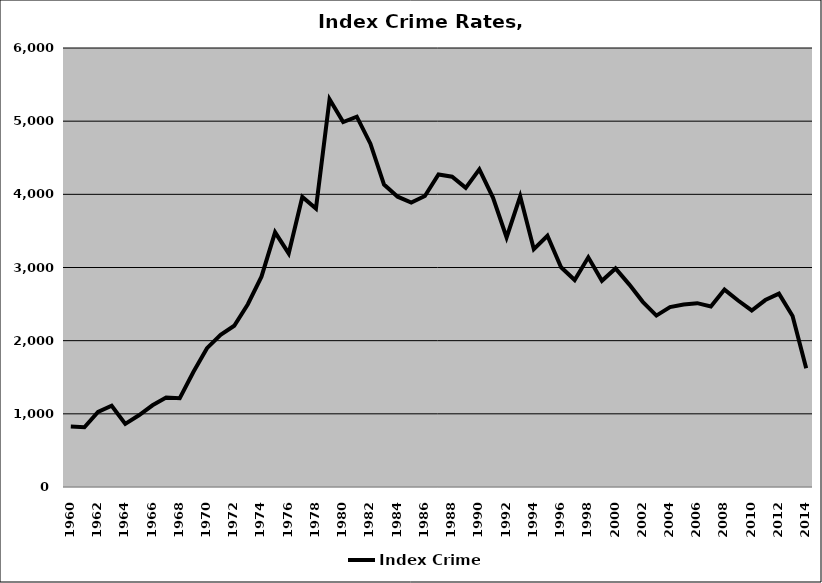
| Category | Index Crime |
|---|---|
| 1960.0 | 825.38 |
| 1961.0 | 816.709 |
| 1962.0 | 1025.897 |
| 1963.0 | 1111.282 |
| 1964.0 | 862.347 |
| 1965.0 | 980.353 |
| 1966.0 | 1117.037 |
| 1967.0 | 1221.823 |
| 1968.0 | 1212.559 |
| 1969.0 | 1571.298 |
| 1970.0 | 1897.098 |
| 1971.0 | 2080.349 |
| 1972.0 | 2204.545 |
| 1973.0 | 2498.06 |
| 1974.0 | 2874.681 |
| 1975.0 | 3481.104 |
| 1976.0 | 3192.227 |
| 1977.0 | 3963.975 |
| 1978.0 | 3806.571 |
| 1979.0 | 5299.189 |
| 1980.0 | 4988.471 |
| 1981.0 | 5060.777 |
| 1982.0 | 4691.86 |
| 1983.0 | 4132.762 |
| 1984.0 | 3967.925 |
| 1985.0 | 3888.037 |
| 1986.0 | 3976.895 |
| 1987.0 | 4271.168 |
| 1988.0 | 4240.468 |
| 1989.0 | 4088.536 |
| 1990.0 | 4340.942 |
| 1991.0 | 3955.203 |
| 1992.0 | 3410 |
| 1993.0 | 3972.396 |
| 1994.0 | 3250.345 |
| 1995.0 | 3433.675 |
| 1996.0 | 3002.886 |
| 1997.0 | 2828.183 |
| 1998.0 | 3139.086 |
| 1999.0 | 2818.574 |
| 2000.0 | 2986.891 |
| 2001.0 | 2769.757 |
| 2002.0 | 2530.791 |
| 2003.0 | 2342.805 |
| 2004.0 | 2458.337 |
| 2005.0 | 2495.393 |
| 2006.0 | 2512.55 |
| 2007.0 | 2466.302 |
| 2008.0 | 2698.177 |
| 2009.0 | 2548.733 |
| 2010.0 | 2412.5 |
| 2011.0 | 2555.251 |
| 2012.0 | 2643.01 |
| 2013.0 | 2338.18 |
| 2014.0 | 1623.622 |